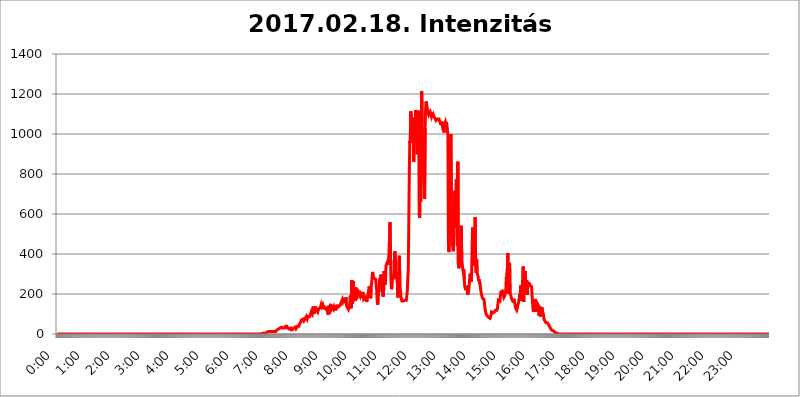
| Category | 2017.02.18. Intenzitás [W/m^2] |
|---|---|
| 0.0 | 0 |
| 0.0006944444444444445 | 0 |
| 0.001388888888888889 | 0 |
| 0.0020833333333333333 | 0 |
| 0.002777777777777778 | 0 |
| 0.003472222222222222 | 0 |
| 0.004166666666666667 | 0 |
| 0.004861111111111111 | 0 |
| 0.005555555555555556 | 0 |
| 0.0062499999999999995 | 0 |
| 0.006944444444444444 | 0 |
| 0.007638888888888889 | 0 |
| 0.008333333333333333 | 0 |
| 0.009027777777777779 | 0 |
| 0.009722222222222222 | 0 |
| 0.010416666666666666 | 0 |
| 0.011111111111111112 | 0 |
| 0.011805555555555555 | 0 |
| 0.012499999999999999 | 0 |
| 0.013194444444444444 | 0 |
| 0.013888888888888888 | 0 |
| 0.014583333333333332 | 0 |
| 0.015277777777777777 | 0 |
| 0.015972222222222224 | 0 |
| 0.016666666666666666 | 0 |
| 0.017361111111111112 | 0 |
| 0.018055555555555557 | 0 |
| 0.01875 | 0 |
| 0.019444444444444445 | 0 |
| 0.02013888888888889 | 0 |
| 0.020833333333333332 | 0 |
| 0.02152777777777778 | 0 |
| 0.022222222222222223 | 0 |
| 0.02291666666666667 | 0 |
| 0.02361111111111111 | 0 |
| 0.024305555555555556 | 0 |
| 0.024999999999999998 | 0 |
| 0.025694444444444447 | 0 |
| 0.02638888888888889 | 0 |
| 0.027083333333333334 | 0 |
| 0.027777777777777776 | 0 |
| 0.02847222222222222 | 0 |
| 0.029166666666666664 | 0 |
| 0.029861111111111113 | 0 |
| 0.030555555555555555 | 0 |
| 0.03125 | 0 |
| 0.03194444444444445 | 0 |
| 0.03263888888888889 | 0 |
| 0.03333333333333333 | 0 |
| 0.034027777777777775 | 0 |
| 0.034722222222222224 | 0 |
| 0.035416666666666666 | 0 |
| 0.036111111111111115 | 0 |
| 0.03680555555555556 | 0 |
| 0.0375 | 0 |
| 0.03819444444444444 | 0 |
| 0.03888888888888889 | 0 |
| 0.03958333333333333 | 0 |
| 0.04027777777777778 | 0 |
| 0.04097222222222222 | 0 |
| 0.041666666666666664 | 0 |
| 0.042361111111111106 | 0 |
| 0.04305555555555556 | 0 |
| 0.043750000000000004 | 0 |
| 0.044444444444444446 | 0 |
| 0.04513888888888889 | 0 |
| 0.04583333333333334 | 0 |
| 0.04652777777777778 | 0 |
| 0.04722222222222222 | 0 |
| 0.04791666666666666 | 0 |
| 0.04861111111111111 | 0 |
| 0.049305555555555554 | 0 |
| 0.049999999999999996 | 0 |
| 0.05069444444444445 | 0 |
| 0.051388888888888894 | 0 |
| 0.052083333333333336 | 0 |
| 0.05277777777777778 | 0 |
| 0.05347222222222222 | 0 |
| 0.05416666666666667 | 0 |
| 0.05486111111111111 | 0 |
| 0.05555555555555555 | 0 |
| 0.05625 | 0 |
| 0.05694444444444444 | 0 |
| 0.057638888888888885 | 0 |
| 0.05833333333333333 | 0 |
| 0.05902777777777778 | 0 |
| 0.059722222222222225 | 0 |
| 0.06041666666666667 | 0 |
| 0.061111111111111116 | 0 |
| 0.06180555555555556 | 0 |
| 0.0625 | 0 |
| 0.06319444444444444 | 0 |
| 0.06388888888888888 | 0 |
| 0.06458333333333334 | 0 |
| 0.06527777777777778 | 0 |
| 0.06597222222222222 | 0 |
| 0.06666666666666667 | 0 |
| 0.06736111111111111 | 0 |
| 0.06805555555555555 | 0 |
| 0.06874999999999999 | 0 |
| 0.06944444444444443 | 0 |
| 0.07013888888888889 | 0 |
| 0.07083333333333333 | 0 |
| 0.07152777777777779 | 0 |
| 0.07222222222222223 | 0 |
| 0.07291666666666667 | 0 |
| 0.07361111111111111 | 0 |
| 0.07430555555555556 | 0 |
| 0.075 | 0 |
| 0.07569444444444444 | 0 |
| 0.0763888888888889 | 0 |
| 0.07708333333333334 | 0 |
| 0.07777777777777778 | 0 |
| 0.07847222222222222 | 0 |
| 0.07916666666666666 | 0 |
| 0.0798611111111111 | 0 |
| 0.08055555555555556 | 0 |
| 0.08125 | 0 |
| 0.08194444444444444 | 0 |
| 0.08263888888888889 | 0 |
| 0.08333333333333333 | 0 |
| 0.08402777777777777 | 0 |
| 0.08472222222222221 | 0 |
| 0.08541666666666665 | 0 |
| 0.08611111111111112 | 0 |
| 0.08680555555555557 | 0 |
| 0.08750000000000001 | 0 |
| 0.08819444444444445 | 0 |
| 0.08888888888888889 | 0 |
| 0.08958333333333333 | 0 |
| 0.09027777777777778 | 0 |
| 0.09097222222222222 | 0 |
| 0.09166666666666667 | 0 |
| 0.09236111111111112 | 0 |
| 0.09305555555555556 | 0 |
| 0.09375 | 0 |
| 0.09444444444444444 | 0 |
| 0.09513888888888888 | 0 |
| 0.09583333333333333 | 0 |
| 0.09652777777777777 | 0 |
| 0.09722222222222222 | 0 |
| 0.09791666666666667 | 0 |
| 0.09861111111111111 | 0 |
| 0.09930555555555555 | 0 |
| 0.09999999999999999 | 0 |
| 0.10069444444444443 | 0 |
| 0.1013888888888889 | 0 |
| 0.10208333333333335 | 0 |
| 0.10277777777777779 | 0 |
| 0.10347222222222223 | 0 |
| 0.10416666666666667 | 0 |
| 0.10486111111111111 | 0 |
| 0.10555555555555556 | 0 |
| 0.10625 | 0 |
| 0.10694444444444444 | 0 |
| 0.1076388888888889 | 0 |
| 0.10833333333333334 | 0 |
| 0.10902777777777778 | 0 |
| 0.10972222222222222 | 0 |
| 0.1111111111111111 | 0 |
| 0.11180555555555556 | 0 |
| 0.11180555555555556 | 0 |
| 0.1125 | 0 |
| 0.11319444444444444 | 0 |
| 0.11388888888888889 | 0 |
| 0.11458333333333333 | 0 |
| 0.11527777777777777 | 0 |
| 0.11597222222222221 | 0 |
| 0.11666666666666665 | 0 |
| 0.1173611111111111 | 0 |
| 0.11805555555555557 | 0 |
| 0.11944444444444445 | 0 |
| 0.12013888888888889 | 0 |
| 0.12083333333333333 | 0 |
| 0.12152777777777778 | 0 |
| 0.12222222222222223 | 0 |
| 0.12291666666666667 | 0 |
| 0.12291666666666667 | 0 |
| 0.12361111111111112 | 0 |
| 0.12430555555555556 | 0 |
| 0.125 | 0 |
| 0.12569444444444444 | 0 |
| 0.12638888888888888 | 0 |
| 0.12708333333333333 | 0 |
| 0.16875 | 0 |
| 0.12847222222222224 | 0 |
| 0.12916666666666668 | 0 |
| 0.12986111111111112 | 0 |
| 0.13055555555555556 | 0 |
| 0.13125 | 0 |
| 0.13194444444444445 | 0 |
| 0.1326388888888889 | 0 |
| 0.13333333333333333 | 0 |
| 0.13402777777777777 | 0 |
| 0.13402777777777777 | 0 |
| 0.13472222222222222 | 0 |
| 0.13541666666666666 | 0 |
| 0.1361111111111111 | 0 |
| 0.13749999999999998 | 0 |
| 0.13819444444444443 | 0 |
| 0.1388888888888889 | 0 |
| 0.13958333333333334 | 0 |
| 0.14027777777777778 | 0 |
| 0.14097222222222222 | 0 |
| 0.14166666666666666 | 0 |
| 0.1423611111111111 | 0 |
| 0.14305555555555557 | 0 |
| 0.14375000000000002 | 0 |
| 0.14444444444444446 | 0 |
| 0.1451388888888889 | 0 |
| 0.1451388888888889 | 0 |
| 0.14652777777777778 | 0 |
| 0.14722222222222223 | 0 |
| 0.14791666666666667 | 0 |
| 0.1486111111111111 | 0 |
| 0.14930555555555555 | 0 |
| 0.15 | 0 |
| 0.15069444444444444 | 0 |
| 0.15138888888888888 | 0 |
| 0.15208333333333332 | 0 |
| 0.15277777777777776 | 0 |
| 0.15347222222222223 | 0 |
| 0.15416666666666667 | 0 |
| 0.15486111111111112 | 0 |
| 0.15555555555555556 | 0 |
| 0.15625 | 0 |
| 0.15694444444444444 | 0 |
| 0.15763888888888888 | 0 |
| 0.15833333333333333 | 0 |
| 0.15902777777777777 | 0 |
| 0.15972222222222224 | 0 |
| 0.16041666666666668 | 0 |
| 0.16111111111111112 | 0 |
| 0.16180555555555556 | 0 |
| 0.1625 | 0 |
| 0.16319444444444445 | 0 |
| 0.1638888888888889 | 0 |
| 0.16458333333333333 | 0 |
| 0.16527777777777777 | 0 |
| 0.16597222222222222 | 0 |
| 0.16666666666666666 | 0 |
| 0.1673611111111111 | 0 |
| 0.16805555555555554 | 0 |
| 0.16874999999999998 | 0 |
| 0.16944444444444443 | 0 |
| 0.17013888888888887 | 0 |
| 0.1708333333333333 | 0 |
| 0.17152777777777775 | 0 |
| 0.17222222222222225 | 0 |
| 0.1729166666666667 | 0 |
| 0.17361111111111113 | 0 |
| 0.17430555555555557 | 0 |
| 0.17500000000000002 | 0 |
| 0.17569444444444446 | 0 |
| 0.1763888888888889 | 0 |
| 0.17708333333333334 | 0 |
| 0.17777777777777778 | 0 |
| 0.17847222222222223 | 0 |
| 0.17916666666666667 | 0 |
| 0.1798611111111111 | 0 |
| 0.18055555555555555 | 0 |
| 0.18125 | 0 |
| 0.18194444444444444 | 0 |
| 0.1826388888888889 | 0 |
| 0.18333333333333335 | 0 |
| 0.1840277777777778 | 0 |
| 0.18472222222222223 | 0 |
| 0.18541666666666667 | 0 |
| 0.18611111111111112 | 0 |
| 0.18680555555555556 | 0 |
| 0.1875 | 0 |
| 0.18819444444444444 | 0 |
| 0.18888888888888888 | 0 |
| 0.18958333333333333 | 0 |
| 0.19027777777777777 | 0 |
| 0.1909722222222222 | 0 |
| 0.19166666666666665 | 0 |
| 0.19236111111111112 | 0 |
| 0.19305555555555554 | 0 |
| 0.19375 | 0 |
| 0.19444444444444445 | 0 |
| 0.1951388888888889 | 0 |
| 0.19583333333333333 | 0 |
| 0.19652777777777777 | 0 |
| 0.19722222222222222 | 0 |
| 0.19791666666666666 | 0 |
| 0.1986111111111111 | 0 |
| 0.19930555555555554 | 0 |
| 0.19999999999999998 | 0 |
| 0.20069444444444443 | 0 |
| 0.20138888888888887 | 0 |
| 0.2020833333333333 | 0 |
| 0.2027777777777778 | 0 |
| 0.2034722222222222 | 0 |
| 0.2041666666666667 | 0 |
| 0.20486111111111113 | 0 |
| 0.20555555555555557 | 0 |
| 0.20625000000000002 | 0 |
| 0.20694444444444446 | 0 |
| 0.2076388888888889 | 0 |
| 0.20833333333333334 | 0 |
| 0.20902777777777778 | 0 |
| 0.20972222222222223 | 0 |
| 0.21041666666666667 | 0 |
| 0.2111111111111111 | 0 |
| 0.21180555555555555 | 0 |
| 0.2125 | 0 |
| 0.21319444444444444 | 0 |
| 0.2138888888888889 | 0 |
| 0.21458333333333335 | 0 |
| 0.2152777777777778 | 0 |
| 0.21597222222222223 | 0 |
| 0.21666666666666667 | 0 |
| 0.21736111111111112 | 0 |
| 0.21805555555555556 | 0 |
| 0.21875 | 0 |
| 0.21944444444444444 | 0 |
| 0.22013888888888888 | 0 |
| 0.22083333333333333 | 0 |
| 0.22152777777777777 | 0 |
| 0.2222222222222222 | 0 |
| 0.22291666666666665 | 0 |
| 0.2236111111111111 | 0 |
| 0.22430555555555556 | 0 |
| 0.225 | 0 |
| 0.22569444444444445 | 0 |
| 0.2263888888888889 | 0 |
| 0.22708333333333333 | 0 |
| 0.22777777777777777 | 0 |
| 0.22847222222222222 | 0 |
| 0.22916666666666666 | 0 |
| 0.2298611111111111 | 0 |
| 0.23055555555555554 | 0 |
| 0.23124999999999998 | 0 |
| 0.23194444444444443 | 0 |
| 0.23263888888888887 | 0 |
| 0.2333333333333333 | 0 |
| 0.2340277777777778 | 0 |
| 0.2347222222222222 | 0 |
| 0.2354166666666667 | 0 |
| 0.23611111111111113 | 0 |
| 0.23680555555555557 | 0 |
| 0.23750000000000002 | 0 |
| 0.23819444444444446 | 0 |
| 0.2388888888888889 | 0 |
| 0.23958333333333334 | 0 |
| 0.24027777777777778 | 0 |
| 0.24097222222222223 | 0 |
| 0.24166666666666667 | 0 |
| 0.2423611111111111 | 0 |
| 0.24305555555555555 | 0 |
| 0.24375 | 0 |
| 0.24444444444444446 | 0 |
| 0.24513888888888888 | 0 |
| 0.24583333333333335 | 0 |
| 0.2465277777777778 | 0 |
| 0.24722222222222223 | 0 |
| 0.24791666666666667 | 0 |
| 0.24861111111111112 | 0 |
| 0.24930555555555556 | 0 |
| 0.25 | 0 |
| 0.25069444444444444 | 0 |
| 0.2513888888888889 | 0 |
| 0.2520833333333333 | 0 |
| 0.25277777777777777 | 0 |
| 0.2534722222222222 | 0 |
| 0.25416666666666665 | 0 |
| 0.2548611111111111 | 0 |
| 0.2555555555555556 | 0 |
| 0.25625000000000003 | 0 |
| 0.2569444444444445 | 0 |
| 0.2576388888888889 | 0 |
| 0.25833333333333336 | 0 |
| 0.2590277777777778 | 0 |
| 0.25972222222222224 | 0 |
| 0.2604166666666667 | 0 |
| 0.2611111111111111 | 0 |
| 0.26180555555555557 | 0 |
| 0.2625 | 0 |
| 0.26319444444444445 | 0 |
| 0.2638888888888889 | 0 |
| 0.26458333333333334 | 0 |
| 0.2652777777777778 | 0 |
| 0.2659722222222222 | 0 |
| 0.26666666666666666 | 0 |
| 0.2673611111111111 | 0 |
| 0.26805555555555555 | 0 |
| 0.26875 | 0 |
| 0.26944444444444443 | 0 |
| 0.2701388888888889 | 0 |
| 0.2708333333333333 | 0 |
| 0.27152777777777776 | 0 |
| 0.2722222222222222 | 0 |
| 0.27291666666666664 | 0 |
| 0.2736111111111111 | 0 |
| 0.2743055555555555 | 0 |
| 0.27499999999999997 | 0 |
| 0.27569444444444446 | 0 |
| 0.27638888888888885 | 0 |
| 0.27708333333333335 | 0 |
| 0.2777777777777778 | 0 |
| 0.27847222222222223 | 0 |
| 0.2791666666666667 | 0 |
| 0.2798611111111111 | 0 |
| 0.28055555555555556 | 0 |
| 0.28125 | 0 |
| 0.28194444444444444 | 0 |
| 0.2826388888888889 | 0 |
| 0.2833333333333333 | 0 |
| 0.28402777777777777 | 0 |
| 0.2847222222222222 | 0 |
| 0.28541666666666665 | 0 |
| 0.28611111111111115 | 3.525 |
| 0.28680555555555554 | 3.525 |
| 0.28750000000000003 | 3.525 |
| 0.2881944444444445 | 3.525 |
| 0.2888888888888889 | 3.525 |
| 0.28958333333333336 | 3.525 |
| 0.2902777777777778 | 3.525 |
| 0.29097222222222224 | 3.525 |
| 0.2916666666666667 | 3.525 |
| 0.2923611111111111 | 7.887 |
| 0.29305555555555557 | 7.887 |
| 0.29375 | 7.887 |
| 0.29444444444444445 | 7.887 |
| 0.2951388888888889 | 7.887 |
| 0.29583333333333334 | 12.257 |
| 0.2965277777777778 | 12.257 |
| 0.2972222222222222 | 12.257 |
| 0.29791666666666666 | 12.257 |
| 0.2986111111111111 | 12.257 |
| 0.29930555555555555 | 12.257 |
| 0.3 | 12.257 |
| 0.30069444444444443 | 12.257 |
| 0.3013888888888889 | 12.257 |
| 0.3020833333333333 | 12.257 |
| 0.30277777777777776 | 12.257 |
| 0.3034722222222222 | 12.257 |
| 0.30416666666666664 | 12.257 |
| 0.3048611111111111 | 16.636 |
| 0.3055555555555555 | 16.636 |
| 0.30624999999999997 | 12.257 |
| 0.3069444444444444 | 16.636 |
| 0.3076388888888889 | 16.636 |
| 0.30833333333333335 | 21.024 |
| 0.3090277777777778 | 21.024 |
| 0.30972222222222223 | 21.024 |
| 0.3104166666666667 | 25.419 |
| 0.3111111111111111 | 25.419 |
| 0.31180555555555556 | 29.823 |
| 0.3125 | 29.823 |
| 0.31319444444444444 | 34.234 |
| 0.3138888888888889 | 34.234 |
| 0.3145833333333333 | 34.234 |
| 0.31527777777777777 | 38.653 |
| 0.3159722222222222 | 38.653 |
| 0.31666666666666665 | 29.823 |
| 0.31736111111111115 | 25.419 |
| 0.31805555555555554 | 25.419 |
| 0.31875000000000003 | 29.823 |
| 0.3194444444444445 | 34.234 |
| 0.3201388888888889 | 38.653 |
| 0.32083333333333336 | 38.653 |
| 0.3215277777777778 | 38.653 |
| 0.32222222222222224 | 38.653 |
| 0.3229166666666667 | 29.823 |
| 0.3236111111111111 | 29.823 |
| 0.32430555555555557 | 25.419 |
| 0.325 | 25.419 |
| 0.32569444444444445 | 21.024 |
| 0.3263888888888889 | 25.419 |
| 0.32708333333333334 | 29.823 |
| 0.3277777777777778 | 21.024 |
| 0.3284722222222222 | 25.419 |
| 0.32916666666666666 | 25.419 |
| 0.3298611111111111 | 21.024 |
| 0.33055555555555555 | 21.024 |
| 0.33125 | 29.823 |
| 0.33194444444444443 | 34.234 |
| 0.3326388888888889 | 34.234 |
| 0.3333333333333333 | 34.234 |
| 0.3340277777777778 | 34.234 |
| 0.3347222222222222 | 25.419 |
| 0.3354166666666667 | 25.419 |
| 0.3361111111111111 | 29.823 |
| 0.3368055555555556 | 38.653 |
| 0.33749999999999997 | 43.079 |
| 0.33819444444444446 | 38.653 |
| 0.33888888888888885 | 38.653 |
| 0.33958333333333335 | 47.511 |
| 0.34027777777777773 | 51.951 |
| 0.34097222222222223 | 51.951 |
| 0.3416666666666666 | 60.85 |
| 0.3423611111111111 | 69.775 |
| 0.3430555555555555 | 65.31 |
| 0.34375 | 69.775 |
| 0.3444444444444445 | 74.246 |
| 0.3451388888888889 | 74.246 |
| 0.3458333333333334 | 65.31 |
| 0.34652777777777777 | 69.775 |
| 0.34722222222222227 | 74.246 |
| 0.34791666666666665 | 74.246 |
| 0.34861111111111115 | 74.246 |
| 0.34930555555555554 | 87.692 |
| 0.35000000000000003 | 92.184 |
| 0.3506944444444444 | 74.246 |
| 0.3513888888888889 | 69.775 |
| 0.3520833333333333 | 87.692 |
| 0.3527777777777778 | 92.184 |
| 0.3534722222222222 | 87.692 |
| 0.3541666666666667 | 87.692 |
| 0.3548611111111111 | 92.184 |
| 0.35555555555555557 | 92.184 |
| 0.35625 | 110.201 |
| 0.35694444444444445 | 110.201 |
| 0.3576388888888889 | 101.184 |
| 0.35833333333333334 | 123.758 |
| 0.3590277777777778 | 137.347 |
| 0.3597222222222222 | 123.758 |
| 0.36041666666666666 | 101.184 |
| 0.3611111111111111 | 114.716 |
| 0.36180555555555555 | 137.347 |
| 0.3625 | 141.884 |
| 0.36319444444444443 | 123.758 |
| 0.3638888888888889 | 123.758 |
| 0.3645833333333333 | 128.284 |
| 0.3652777777777778 | 110.201 |
| 0.3659722222222222 | 119.235 |
| 0.3666666666666667 | 123.758 |
| 0.3673611111111111 | 128.284 |
| 0.3680555555555556 | 132.814 |
| 0.36874999999999997 | 128.284 |
| 0.36944444444444446 | 137.347 |
| 0.37013888888888885 | 146.423 |
| 0.37083333333333335 | 137.347 |
| 0.37152777777777773 | 132.814 |
| 0.37222222222222223 | 146.423 |
| 0.3729166666666666 | 132.814 |
| 0.3736111111111111 | 123.758 |
| 0.3743055555555555 | 137.347 |
| 0.375 | 132.814 |
| 0.3756944444444445 | 132.814 |
| 0.3763888888888889 | 132.814 |
| 0.3770833333333334 | 123.758 |
| 0.37777777777777777 | 119.235 |
| 0.37847222222222227 | 128.284 |
| 0.37916666666666665 | 114.716 |
| 0.37986111111111115 | 96.682 |
| 0.38055555555555554 | 132.814 |
| 0.38125000000000003 | 141.884 |
| 0.3819444444444444 | 119.235 |
| 0.3826388888888889 | 137.347 |
| 0.3833333333333333 | 150.964 |
| 0.3840277777777778 | 119.235 |
| 0.3847222222222222 | 123.758 |
| 0.3854166666666667 | 114.716 |
| 0.3861111111111111 | 132.814 |
| 0.38680555555555557 | 137.347 |
| 0.3875 | 123.758 |
| 0.38819444444444445 | 132.814 |
| 0.3888888888888889 | 123.758 |
| 0.38958333333333334 | 123.758 |
| 0.3902777777777778 | 128.284 |
| 0.3909722222222222 | 123.758 |
| 0.39166666666666666 | 128.284 |
| 0.3923611111111111 | 146.423 |
| 0.39305555555555555 | 132.814 |
| 0.39375 | 132.814 |
| 0.39444444444444443 | 132.814 |
| 0.3951388888888889 | 137.347 |
| 0.3958333333333333 | 137.347 |
| 0.3965277777777778 | 141.884 |
| 0.3972222222222222 | 146.423 |
| 0.3979166666666667 | 155.509 |
| 0.3986111111111111 | 155.509 |
| 0.3993055555555556 | 160.056 |
| 0.39999999999999997 | 173.709 |
| 0.40069444444444446 | 164.605 |
| 0.40138888888888885 | 173.709 |
| 0.40208333333333335 | 169.156 |
| 0.40277777777777773 | 178.264 |
| 0.40347222222222223 | 173.709 |
| 0.4041666666666666 | 155.509 |
| 0.4048611111111111 | 182.82 |
| 0.4055555555555555 | 146.423 |
| 0.40625 | 137.347 |
| 0.4069444444444445 | 141.884 |
| 0.4076388888888889 | 137.347 |
| 0.4083333333333334 | 123.758 |
| 0.40902777777777777 | 132.814 |
| 0.40972222222222227 | 146.423 |
| 0.41041666666666665 | 128.284 |
| 0.41111111111111115 | 191.937 |
| 0.41180555555555554 | 137.347 |
| 0.41250000000000003 | 128.284 |
| 0.4131944444444444 | 269.49 |
| 0.4138888888888889 | 150.964 |
| 0.4145833333333333 | 164.605 |
| 0.4152777777777778 | 264.932 |
| 0.4159722222222222 | 178.264 |
| 0.4166666666666667 | 169.156 |
| 0.4173611111111111 | 205.62 |
| 0.41805555555555557 | 164.605 |
| 0.41875 | 233 |
| 0.41944444444444445 | 191.937 |
| 0.4201388888888889 | 173.709 |
| 0.42083333333333334 | 219.309 |
| 0.4215277777777778 | 191.937 |
| 0.4222222222222222 | 187.378 |
| 0.42291666666666666 | 210.182 |
| 0.4236111111111111 | 205.62 |
| 0.42430555555555555 | 201.058 |
| 0.425 | 191.937 |
| 0.42569444444444443 | 201.058 |
| 0.4263888888888889 | 201.058 |
| 0.4270833333333333 | 191.937 |
| 0.4277777777777778 | 201.058 |
| 0.4284722222222222 | 210.182 |
| 0.4291666666666667 | 196.497 |
| 0.4298611111111111 | 173.709 |
| 0.4305555555555556 | 169.156 |
| 0.43124999999999997 | 173.709 |
| 0.43194444444444446 | 182.82 |
| 0.43263888888888885 | 182.82 |
| 0.43333333333333335 | 169.156 |
| 0.43402777777777773 | 160.056 |
| 0.43472222222222223 | 173.709 |
| 0.4354166666666666 | 178.264 |
| 0.4361111111111111 | 205.62 |
| 0.4368055555555555 | 219.309 |
| 0.4375 | 237.564 |
| 0.4381944444444445 | 214.746 |
| 0.4388888888888889 | 219.309 |
| 0.4395833333333334 | 178.264 |
| 0.44027777777777777 | 242.127 |
| 0.44097222222222227 | 255.813 |
| 0.44166666666666665 | 287.709 |
| 0.44236111111111115 | 310.44 |
| 0.44305555555555554 | 287.709 |
| 0.44375000000000003 | 287.709 |
| 0.4444444444444444 | 278.603 |
| 0.4451388888888889 | 278.603 |
| 0.4458333333333333 | 278.603 |
| 0.4465277777777778 | 274.047 |
| 0.4472222222222222 | 278.603 |
| 0.4479166666666667 | 223.873 |
| 0.4486111111111111 | 173.709 |
| 0.44930555555555557 | 146.423 |
| 0.45 | 160.056 |
| 0.45069444444444445 | 210.182 |
| 0.4513888888888889 | 223.873 |
| 0.45208333333333334 | 278.603 |
| 0.4527777777777778 | 255.813 |
| 0.4534722222222222 | 283.156 |
| 0.45416666666666666 | 296.808 |
| 0.4548611111111111 | 246.689 |
| 0.45555555555555555 | 210.182 |
| 0.45625 | 237.564 |
| 0.45694444444444443 | 187.378 |
| 0.4576388888888889 | 201.058 |
| 0.4583333333333333 | 314.98 |
| 0.4590277777777778 | 310.44 |
| 0.4597222222222222 | 246.689 |
| 0.4604166666666667 | 274.047 |
| 0.4611111111111111 | 342.162 |
| 0.4618055555555556 | 346.682 |
| 0.46249999999999997 | 342.162 |
| 0.46319444444444446 | 360.221 |
| 0.46388888888888885 | 346.682 |
| 0.46458333333333335 | 360.221 |
| 0.46527777777777773 | 405.108 |
| 0.46597222222222223 | 471.582 |
| 0.4666666666666666 | 558.261 |
| 0.4673611111111111 | 396.164 |
| 0.4680555555555555 | 269.49 |
| 0.46875 | 223.873 |
| 0.4694444444444445 | 237.564 |
| 0.4701388888888889 | 278.603 |
| 0.4708333333333334 | 278.603 |
| 0.47152777777777777 | 287.709 |
| 0.47222222222222227 | 274.047 |
| 0.47291666666666665 | 382.715 |
| 0.47361111111111115 | 414.035 |
| 0.47430555555555554 | 364.728 |
| 0.47500000000000003 | 278.603 |
| 0.4756944444444444 | 305.898 |
| 0.4763888888888889 | 278.603 |
| 0.4770833333333333 | 251.251 |
| 0.4777777777777778 | 182.82 |
| 0.4784722222222222 | 260.373 |
| 0.4791666666666667 | 369.23 |
| 0.4798611111111111 | 391.685 |
| 0.48055555555555557 | 242.127 |
| 0.48125 | 219.309 |
| 0.48194444444444445 | 191.937 |
| 0.4826388888888889 | 173.709 |
| 0.48333333333333334 | 164.605 |
| 0.4840277777777778 | 160.056 |
| 0.4847222222222222 | 160.056 |
| 0.48541666666666666 | 164.605 |
| 0.4861111111111111 | 164.605 |
| 0.48680555555555555 | 164.605 |
| 0.4875 | 169.156 |
| 0.48819444444444443 | 173.709 |
| 0.4888888888888889 | 169.156 |
| 0.4895833333333333 | 169.156 |
| 0.4902777777777778 | 173.709 |
| 0.4909722222222222 | 214.746 |
| 0.4916666666666667 | 278.603 |
| 0.4923611111111111 | 324.052 |
| 0.4930555555555556 | 558.261 |
| 0.49374999999999997 | 791.169 |
| 0.49444444444444446 | 966.295 |
| 0.49513888888888885 | 955.071 |
| 0.49583333333333335 | 1112.618 |
| 0.49652777777777773 | 1089.873 |
| 0.49722222222222223 | 1052.255 |
| 0.4979166666666666 | 1074.789 |
| 0.4986111111111111 | 1074.789 |
| 0.4993055555555555 | 1059.756 |
| 0.5 | 860.676 |
| 0.5006944444444444 | 1082.324 |
| 0.5013888888888889 | 1063.51 |
| 0.5020833333333333 | 966.295 |
| 0.5027777777777778 | 1120.238 |
| 0.5034722222222222 | 1116.426 |
| 0.5041666666666667 | 996.182 |
| 0.5048611111111111 | 898.668 |
| 0.5055555555555555 | 999.916 |
| 0.50625 | 1116.426 |
| 0.5069444444444444 | 1089.873 |
| 0.5076388888888889 | 596.45 |
| 0.5083333333333333 | 579.542 |
| 0.5090277777777777 | 973.772 |
| 0.5097222222222222 | 663.019 |
| 0.5104166666666666 | 894.885 |
| 0.5111111111111112 | 1213.804 |
| 0.5118055555555555 | 1056.004 |
| 0.5125000000000001 | 1059.756 |
| 0.5131944444444444 | 787.258 |
| 0.513888888888889 | 928.819 |
| 0.5145833333333333 | 751.803 |
| 0.5152777777777778 | 675.311 |
| 0.5159722222222222 | 1029.798 |
| 0.5166666666666667 | 1127.879 |
| 0.517361111111111 | 1162.571 |
| 0.5180555555555556 | 1147.086 |
| 0.5187499999999999 | 1135.543 |
| 0.5194444444444445 | 1112.618 |
| 0.5201388888888888 | 1108.816 |
| 0.5208333333333334 | 1097.437 |
| 0.5215277777777778 | 1105.019 |
| 0.5222222222222223 | 1105.019 |
| 0.5229166666666667 | 1112.618 |
| 0.5236111111111111 | 1112.618 |
| 0.5243055555555556 | 1108.816 |
| 0.525 | 1086.097 |
| 0.5256944444444445 | 1093.653 |
| 0.5263888888888889 | 1093.653 |
| 0.5270833333333333 | 1101.226 |
| 0.5277777777777778 | 1093.653 |
| 0.5284722222222222 | 1086.097 |
| 0.5291666666666667 | 1082.324 |
| 0.5298611111111111 | 1082.324 |
| 0.5305555555555556 | 1074.789 |
| 0.53125 | 1067.267 |
| 0.5319444444444444 | 1067.267 |
| 0.5326388888888889 | 1067.267 |
| 0.5333333333333333 | 1074.789 |
| 0.5340277777777778 | 1071.027 |
| 0.5347222222222222 | 1071.027 |
| 0.5354166666666667 | 1074.789 |
| 0.5361111111111111 | 1071.027 |
| 0.5368055555555555 | 1071.027 |
| 0.5375 | 1052.255 |
| 0.5381944444444444 | 1052.255 |
| 0.5388888888888889 | 1052.255 |
| 0.5395833333333333 | 1056.004 |
| 0.5402777777777777 | 1037.277 |
| 0.5409722222222222 | 1033.537 |
| 0.5416666666666666 | 1044.762 |
| 0.5423611111111112 | 1007.383 |
| 0.5430555555555555 | 1029.798 |
| 0.5437500000000001 | 1052.255 |
| 0.5444444444444444 | 1059.756 |
| 0.545138888888889 | 1048.508 |
| 0.5458333333333333 | 1059.756 |
| 0.5465277777777778 | 1044.762 |
| 0.5472222222222222 | 1018.587 |
| 0.5479166666666667 | 992.448 |
| 0.548611111111111 | 462.786 |
| 0.5493055555555556 | 409.574 |
| 0.5499999999999999 | 405.108 |
| 0.5506944444444445 | 519.555 |
| 0.5513888888888888 | 921.298 |
| 0.5520833333333334 | 999.916 |
| 0.5527777777777778 | 667.123 |
| 0.5534722222222223 | 515.223 |
| 0.5541666666666667 | 600.661 |
| 0.5548611111111111 | 436.27 |
| 0.5555555555555556 | 414.035 |
| 0.55625 | 532.513 |
| 0.5569444444444445 | 675.311 |
| 0.5576388888888889 | 715.858 |
| 0.5583333333333333 | 617.436 |
| 0.5590277777777778 | 532.513 |
| 0.5597222222222222 | 775.492 |
| 0.5604166666666667 | 747.834 |
| 0.5611111111111111 | 440.702 |
| 0.5618055555555556 | 860.676 |
| 0.5625 | 351.198 |
| 0.5631944444444444 | 328.584 |
| 0.5638888888888889 | 333.113 |
| 0.5645833333333333 | 351.198 |
| 0.5652777777777778 | 391.685 |
| 0.5659722222222222 | 409.574 |
| 0.5666666666666667 | 541.121 |
| 0.5673611111111111 | 373.729 |
| 0.5680555555555555 | 369.23 |
| 0.56875 | 324.052 |
| 0.5694444444444444 | 314.98 |
| 0.5701388888888889 | 324.052 |
| 0.5708333333333333 | 274.047 |
| 0.5715277777777777 | 237.564 |
| 0.5722222222222222 | 228.436 |
| 0.5729166666666666 | 223.873 |
| 0.5736111111111112 | 233 |
| 0.5743055555555555 | 233 |
| 0.5750000000000001 | 214.746 |
| 0.5756944444444444 | 196.497 |
| 0.576388888888889 | 201.058 |
| 0.5770833333333333 | 219.309 |
| 0.5777777777777778 | 246.689 |
| 0.5784722222222222 | 278.603 |
| 0.5791666666666667 | 301.354 |
| 0.579861111111111 | 274.047 |
| 0.5805555555555556 | 260.373 |
| 0.5812499999999999 | 310.44 |
| 0.5819444444444445 | 453.968 |
| 0.5826388888888888 | 532.513 |
| 0.5833333333333334 | 414.035 |
| 0.5840277777777778 | 342.162 |
| 0.5847222222222223 | 346.682 |
| 0.5854166666666667 | 364.728 |
| 0.5861111111111111 | 583.779 |
| 0.5868055555555556 | 364.728 |
| 0.5875 | 305.898 |
| 0.5881944444444445 | 373.729 |
| 0.5888888888888889 | 305.898 |
| 0.5895833333333333 | 305.898 |
| 0.5902777777777778 | 287.709 |
| 0.5909722222222222 | 264.932 |
| 0.5916666666666667 | 274.047 |
| 0.5923611111111111 | 278.603 |
| 0.5930555555555556 | 246.689 |
| 0.59375 | 223.873 |
| 0.5944444444444444 | 210.182 |
| 0.5951388888888889 | 196.497 |
| 0.5958333333333333 | 187.378 |
| 0.5965277777777778 | 178.264 |
| 0.5972222222222222 | 173.709 |
| 0.5979166666666667 | 173.709 |
| 0.5986111111111111 | 173.709 |
| 0.5993055555555555 | 150.964 |
| 0.6 | 123.758 |
| 0.6006944444444444 | 114.716 |
| 0.6013888888888889 | 101.184 |
| 0.6020833333333333 | 96.682 |
| 0.6027777777777777 | 92.184 |
| 0.6034722222222222 | 92.184 |
| 0.6041666666666666 | 87.692 |
| 0.6048611111111112 | 83.205 |
| 0.6055555555555555 | 78.722 |
| 0.6062500000000001 | 78.722 |
| 0.6069444444444444 | 78.722 |
| 0.607638888888889 | 83.205 |
| 0.6083333333333333 | 92.184 |
| 0.6090277777777778 | 110.201 |
| 0.6097222222222222 | 114.716 |
| 0.6104166666666667 | 105.69 |
| 0.611111111111111 | 105.69 |
| 0.6118055555555556 | 105.69 |
| 0.6124999999999999 | 110.201 |
| 0.6131944444444445 | 110.201 |
| 0.6138888888888888 | 114.716 |
| 0.6145833333333334 | 119.235 |
| 0.6152777777777778 | 114.716 |
| 0.6159722222222223 | 114.716 |
| 0.6166666666666667 | 119.235 |
| 0.6173611111111111 | 128.284 |
| 0.6180555555555556 | 150.964 |
| 0.61875 | 169.156 |
| 0.6194444444444445 | 169.156 |
| 0.6201388888888889 | 164.605 |
| 0.6208333333333333 | 164.605 |
| 0.6215277777777778 | 191.937 |
| 0.6222222222222222 | 210.182 |
| 0.6229166666666667 | 210.182 |
| 0.6236111111111111 | 214.746 |
| 0.6243055555555556 | 214.746 |
| 0.625 | 205.62 |
| 0.6256944444444444 | 191.937 |
| 0.6263888888888889 | 182.82 |
| 0.6270833333333333 | 187.378 |
| 0.6277777777777778 | 191.937 |
| 0.6284722222222222 | 205.62 |
| 0.6291666666666667 | 223.873 |
| 0.6298611111111111 | 287.709 |
| 0.6305555555555555 | 274.047 |
| 0.63125 | 324.052 |
| 0.6319444444444444 | 405.108 |
| 0.6326388888888889 | 223.873 |
| 0.6333333333333333 | 201.058 |
| 0.6340277777777777 | 355.712 |
| 0.6347222222222222 | 346.682 |
| 0.6354166666666666 | 201.058 |
| 0.6361111111111112 | 191.937 |
| 0.6368055555555555 | 182.82 |
| 0.6375000000000001 | 173.709 |
| 0.6381944444444444 | 169.156 |
| 0.638888888888889 | 164.605 |
| 0.6395833333333333 | 164.605 |
| 0.6402777777777778 | 169.156 |
| 0.6409722222222222 | 169.156 |
| 0.6416666666666667 | 155.509 |
| 0.642361111111111 | 137.347 |
| 0.6430555555555556 | 128.284 |
| 0.6437499999999999 | 123.758 |
| 0.6444444444444445 | 119.235 |
| 0.6451388888888888 | 128.284 |
| 0.6458333333333334 | 141.884 |
| 0.6465277777777778 | 150.964 |
| 0.6472222222222223 | 160.056 |
| 0.6479166666666667 | 160.056 |
| 0.6486111111111111 | 201.058 |
| 0.6493055555555556 | 164.605 |
| 0.65 | 242.127 |
| 0.6506944444444445 | 237.564 |
| 0.6513888888888889 | 173.709 |
| 0.6520833333333333 | 173.709 |
| 0.6527777777777778 | 269.49 |
| 0.6534722222222222 | 337.639 |
| 0.6541666666666667 | 160.056 |
| 0.6548611111111111 | 255.813 |
| 0.6555555555555556 | 278.603 |
| 0.65625 | 314.98 |
| 0.6569444444444444 | 246.689 |
| 0.6576388888888889 | 223.873 |
| 0.6583333333333333 | 269.49 |
| 0.6590277777777778 | 196.497 |
| 0.6597222222222222 | 228.436 |
| 0.6604166666666667 | 255.813 |
| 0.6611111111111111 | 255.813 |
| 0.6618055555555555 | 251.251 |
| 0.6625 | 251.251 |
| 0.6631944444444444 | 242.127 |
| 0.6638888888888889 | 242.127 |
| 0.6645833333333333 | 246.689 |
| 0.6652777777777777 | 237.564 |
| 0.6659722222222222 | 191.937 |
| 0.6666666666666666 | 155.509 |
| 0.6673611111111111 | 119.235 |
| 0.6680555555555556 | 110.201 |
| 0.6687500000000001 | 160.056 |
| 0.6694444444444444 | 173.709 |
| 0.6701388888888888 | 128.284 |
| 0.6708333333333334 | 155.509 |
| 0.6715277777777778 | 123.758 |
| 0.6722222222222222 | 110.201 |
| 0.6729166666666666 | 155.509 |
| 0.6736111111111112 | 160.056 |
| 0.6743055555555556 | 155.509 |
| 0.6749999999999999 | 141.884 |
| 0.6756944444444444 | 92.184 |
| 0.6763888888888889 | 92.184 |
| 0.6770833333333334 | 137.347 |
| 0.6777777777777777 | 87.692 |
| 0.6784722222222223 | 132.814 |
| 0.6791666666666667 | 123.758 |
| 0.6798611111111111 | 132.814 |
| 0.6805555555555555 | 114.716 |
| 0.68125 | 114.716 |
| 0.6819444444444445 | 96.682 |
| 0.6826388888888889 | 74.246 |
| 0.6833333333333332 | 69.775 |
| 0.6840277777777778 | 65.31 |
| 0.6847222222222222 | 60.85 |
| 0.6854166666666667 | 56.398 |
| 0.686111111111111 | 56.398 |
| 0.6868055555555556 | 56.398 |
| 0.6875 | 56.398 |
| 0.6881944444444444 | 51.951 |
| 0.688888888888889 | 47.511 |
| 0.6895833333333333 | 43.079 |
| 0.6902777777777778 | 38.653 |
| 0.6909722222222222 | 34.234 |
| 0.6916666666666668 | 29.823 |
| 0.6923611111111111 | 25.419 |
| 0.6930555555555555 | 21.024 |
| 0.69375 | 21.024 |
| 0.6944444444444445 | 16.636 |
| 0.6951388888888889 | 16.636 |
| 0.6958333333333333 | 16.636 |
| 0.6965277777777777 | 12.257 |
| 0.6972222222222223 | 12.257 |
| 0.6979166666666666 | 7.887 |
| 0.6986111111111111 | 7.887 |
| 0.6993055555555556 | 3.525 |
| 0.7000000000000001 | 3.525 |
| 0.7006944444444444 | 3.525 |
| 0.7013888888888888 | 3.525 |
| 0.7020833333333334 | 3.525 |
| 0.7027777777777778 | 3.525 |
| 0.7034722222222222 | 0 |
| 0.7041666666666666 | 0 |
| 0.7048611111111112 | 0 |
| 0.7055555555555556 | 0 |
| 0.7062499999999999 | 0 |
| 0.7069444444444444 | 0 |
| 0.7076388888888889 | 0 |
| 0.7083333333333334 | 0 |
| 0.7090277777777777 | 0 |
| 0.7097222222222223 | 0 |
| 0.7104166666666667 | 0 |
| 0.7111111111111111 | 0 |
| 0.7118055555555555 | 0 |
| 0.7125 | 0 |
| 0.7131944444444445 | 0 |
| 0.7138888888888889 | 0 |
| 0.7145833333333332 | 0 |
| 0.7152777777777778 | 0 |
| 0.7159722222222222 | 0 |
| 0.7166666666666667 | 0 |
| 0.717361111111111 | 0 |
| 0.7180555555555556 | 0 |
| 0.71875 | 0 |
| 0.7194444444444444 | 0 |
| 0.720138888888889 | 0 |
| 0.7208333333333333 | 0 |
| 0.7215277777777778 | 0 |
| 0.7222222222222222 | 0 |
| 0.7229166666666668 | 0 |
| 0.7236111111111111 | 0 |
| 0.7243055555555555 | 0 |
| 0.725 | 0 |
| 0.7256944444444445 | 0 |
| 0.7263888888888889 | 0 |
| 0.7270833333333333 | 0 |
| 0.7277777777777777 | 0 |
| 0.7284722222222223 | 0 |
| 0.7291666666666666 | 0 |
| 0.7298611111111111 | 0 |
| 0.7305555555555556 | 0 |
| 0.7312500000000001 | 0 |
| 0.7319444444444444 | 0 |
| 0.7326388888888888 | 0 |
| 0.7333333333333334 | 0 |
| 0.7340277777777778 | 0 |
| 0.7347222222222222 | 0 |
| 0.7354166666666666 | 0 |
| 0.7361111111111112 | 0 |
| 0.7368055555555556 | 0 |
| 0.7374999999999999 | 0 |
| 0.7381944444444444 | 0 |
| 0.7388888888888889 | 0 |
| 0.7395833333333334 | 0 |
| 0.7402777777777777 | 0 |
| 0.7409722222222223 | 0 |
| 0.7416666666666667 | 0 |
| 0.7423611111111111 | 0 |
| 0.7430555555555555 | 0 |
| 0.74375 | 0 |
| 0.7444444444444445 | 0 |
| 0.7451388888888889 | 0 |
| 0.7458333333333332 | 0 |
| 0.7465277777777778 | 0 |
| 0.7472222222222222 | 0 |
| 0.7479166666666667 | 0 |
| 0.748611111111111 | 0 |
| 0.7493055555555556 | 0 |
| 0.75 | 0 |
| 0.7506944444444444 | 0 |
| 0.751388888888889 | 0 |
| 0.7520833333333333 | 0 |
| 0.7527777777777778 | 0 |
| 0.7534722222222222 | 0 |
| 0.7541666666666668 | 0 |
| 0.7548611111111111 | 0 |
| 0.7555555555555555 | 0 |
| 0.75625 | 0 |
| 0.7569444444444445 | 0 |
| 0.7576388888888889 | 0 |
| 0.7583333333333333 | 0 |
| 0.7590277777777777 | 0 |
| 0.7597222222222223 | 0 |
| 0.7604166666666666 | 0 |
| 0.7611111111111111 | 0 |
| 0.7618055555555556 | 0 |
| 0.7625000000000001 | 0 |
| 0.7631944444444444 | 0 |
| 0.7638888888888888 | 0 |
| 0.7645833333333334 | 0 |
| 0.7652777777777778 | 0 |
| 0.7659722222222222 | 0 |
| 0.7666666666666666 | 0 |
| 0.7673611111111112 | 0 |
| 0.7680555555555556 | 0 |
| 0.7687499999999999 | 0 |
| 0.7694444444444444 | 0 |
| 0.7701388888888889 | 0 |
| 0.7708333333333334 | 0 |
| 0.7715277777777777 | 0 |
| 0.7722222222222223 | 0 |
| 0.7729166666666667 | 0 |
| 0.7736111111111111 | 0 |
| 0.7743055555555555 | 0 |
| 0.775 | 0 |
| 0.7756944444444445 | 0 |
| 0.7763888888888889 | 0 |
| 0.7770833333333332 | 0 |
| 0.7777777777777778 | 0 |
| 0.7784722222222222 | 0 |
| 0.7791666666666667 | 0 |
| 0.779861111111111 | 0 |
| 0.7805555555555556 | 0 |
| 0.78125 | 0 |
| 0.7819444444444444 | 0 |
| 0.782638888888889 | 0 |
| 0.7833333333333333 | 0 |
| 0.7840277777777778 | 0 |
| 0.7847222222222222 | 0 |
| 0.7854166666666668 | 0 |
| 0.7861111111111111 | 0 |
| 0.7868055555555555 | 0 |
| 0.7875 | 0 |
| 0.7881944444444445 | 0 |
| 0.7888888888888889 | 0 |
| 0.7895833333333333 | 0 |
| 0.7902777777777777 | 0 |
| 0.7909722222222223 | 0 |
| 0.7916666666666666 | 0 |
| 0.7923611111111111 | 0 |
| 0.7930555555555556 | 0 |
| 0.7937500000000001 | 0 |
| 0.7944444444444444 | 0 |
| 0.7951388888888888 | 0 |
| 0.7958333333333334 | 0 |
| 0.7965277777777778 | 0 |
| 0.7972222222222222 | 0 |
| 0.7979166666666666 | 0 |
| 0.7986111111111112 | 0 |
| 0.7993055555555556 | 0 |
| 0.7999999999999999 | 0 |
| 0.8006944444444444 | 0 |
| 0.8013888888888889 | 0 |
| 0.8020833333333334 | 0 |
| 0.8027777777777777 | 0 |
| 0.8034722222222223 | 0 |
| 0.8041666666666667 | 0 |
| 0.8048611111111111 | 0 |
| 0.8055555555555555 | 0 |
| 0.80625 | 0 |
| 0.8069444444444445 | 0 |
| 0.8076388888888889 | 0 |
| 0.8083333333333332 | 0 |
| 0.8090277777777778 | 0 |
| 0.8097222222222222 | 0 |
| 0.8104166666666667 | 0 |
| 0.811111111111111 | 0 |
| 0.8118055555555556 | 0 |
| 0.8125 | 0 |
| 0.8131944444444444 | 0 |
| 0.813888888888889 | 0 |
| 0.8145833333333333 | 0 |
| 0.8152777777777778 | 0 |
| 0.8159722222222222 | 0 |
| 0.8166666666666668 | 0 |
| 0.8173611111111111 | 0 |
| 0.8180555555555555 | 0 |
| 0.81875 | 0 |
| 0.8194444444444445 | 0 |
| 0.8201388888888889 | 0 |
| 0.8208333333333333 | 0 |
| 0.8215277777777777 | 0 |
| 0.8222222222222223 | 0 |
| 0.8229166666666666 | 0 |
| 0.8236111111111111 | 0 |
| 0.8243055555555556 | 0 |
| 0.8250000000000001 | 0 |
| 0.8256944444444444 | 0 |
| 0.8263888888888888 | 0 |
| 0.8270833333333334 | 0 |
| 0.8277777777777778 | 0 |
| 0.8284722222222222 | 0 |
| 0.8291666666666666 | 0 |
| 0.8298611111111112 | 0 |
| 0.8305555555555556 | 0 |
| 0.8312499999999999 | 0 |
| 0.8319444444444444 | 0 |
| 0.8326388888888889 | 0 |
| 0.8333333333333334 | 0 |
| 0.8340277777777777 | 0 |
| 0.8347222222222223 | 0 |
| 0.8354166666666667 | 0 |
| 0.8361111111111111 | 0 |
| 0.8368055555555555 | 0 |
| 0.8375 | 0 |
| 0.8381944444444445 | 0 |
| 0.8388888888888889 | 0 |
| 0.8395833333333332 | 0 |
| 0.8402777777777778 | 0 |
| 0.8409722222222222 | 0 |
| 0.8416666666666667 | 0 |
| 0.842361111111111 | 0 |
| 0.8430555555555556 | 0 |
| 0.84375 | 0 |
| 0.8444444444444444 | 0 |
| 0.845138888888889 | 0 |
| 0.8458333333333333 | 0 |
| 0.8465277777777778 | 0 |
| 0.8472222222222222 | 0 |
| 0.8479166666666668 | 0 |
| 0.8486111111111111 | 0 |
| 0.8493055555555555 | 0 |
| 0.85 | 0 |
| 0.8506944444444445 | 0 |
| 0.8513888888888889 | 0 |
| 0.8520833333333333 | 0 |
| 0.8527777777777777 | 0 |
| 0.8534722222222223 | 0 |
| 0.8541666666666666 | 0 |
| 0.8548611111111111 | 0 |
| 0.8555555555555556 | 0 |
| 0.8562500000000001 | 0 |
| 0.8569444444444444 | 0 |
| 0.8576388888888888 | 0 |
| 0.8583333333333334 | 0 |
| 0.8590277777777778 | 0 |
| 0.8597222222222222 | 0 |
| 0.8604166666666666 | 0 |
| 0.8611111111111112 | 0 |
| 0.8618055555555556 | 0 |
| 0.8624999999999999 | 0 |
| 0.8631944444444444 | 0 |
| 0.8638888888888889 | 0 |
| 0.8645833333333334 | 0 |
| 0.8652777777777777 | 0 |
| 0.8659722222222223 | 0 |
| 0.8666666666666667 | 0 |
| 0.8673611111111111 | 0 |
| 0.8680555555555555 | 0 |
| 0.86875 | 0 |
| 0.8694444444444445 | 0 |
| 0.8701388888888889 | 0 |
| 0.8708333333333332 | 0 |
| 0.8715277777777778 | 0 |
| 0.8722222222222222 | 0 |
| 0.8729166666666667 | 0 |
| 0.873611111111111 | 0 |
| 0.8743055555555556 | 0 |
| 0.875 | 0 |
| 0.8756944444444444 | 0 |
| 0.876388888888889 | 0 |
| 0.8770833333333333 | 0 |
| 0.8777777777777778 | 0 |
| 0.8784722222222222 | 0 |
| 0.8791666666666668 | 0 |
| 0.8798611111111111 | 0 |
| 0.8805555555555555 | 0 |
| 0.88125 | 0 |
| 0.8819444444444445 | 0 |
| 0.8826388888888889 | 0 |
| 0.8833333333333333 | 0 |
| 0.8840277777777777 | 0 |
| 0.8847222222222223 | 0 |
| 0.8854166666666666 | 0 |
| 0.8861111111111111 | 0 |
| 0.8868055555555556 | 0 |
| 0.8875000000000001 | 0 |
| 0.8881944444444444 | 0 |
| 0.8888888888888888 | 0 |
| 0.8895833333333334 | 0 |
| 0.8902777777777778 | 0 |
| 0.8909722222222222 | 0 |
| 0.8916666666666666 | 0 |
| 0.8923611111111112 | 0 |
| 0.8930555555555556 | 0 |
| 0.8937499999999999 | 0 |
| 0.8944444444444444 | 0 |
| 0.8951388888888889 | 0 |
| 0.8958333333333334 | 0 |
| 0.8965277777777777 | 0 |
| 0.8972222222222223 | 0 |
| 0.8979166666666667 | 0 |
| 0.8986111111111111 | 0 |
| 0.8993055555555555 | 0 |
| 0.9 | 0 |
| 0.9006944444444445 | 0 |
| 0.9013888888888889 | 0 |
| 0.9020833333333332 | 0 |
| 0.9027777777777778 | 0 |
| 0.9034722222222222 | 0 |
| 0.9041666666666667 | 0 |
| 0.904861111111111 | 0 |
| 0.9055555555555556 | 0 |
| 0.90625 | 0 |
| 0.9069444444444444 | 0 |
| 0.907638888888889 | 0 |
| 0.9083333333333333 | 0 |
| 0.9090277777777778 | 0 |
| 0.9097222222222222 | 0 |
| 0.9104166666666668 | 0 |
| 0.9111111111111111 | 0 |
| 0.9118055555555555 | 0 |
| 0.9125 | 0 |
| 0.9131944444444445 | 0 |
| 0.9138888888888889 | 0 |
| 0.9145833333333333 | 0 |
| 0.9152777777777777 | 0 |
| 0.9159722222222223 | 0 |
| 0.9166666666666666 | 0 |
| 0.9173611111111111 | 0 |
| 0.9180555555555556 | 0 |
| 0.9187500000000001 | 0 |
| 0.9194444444444444 | 0 |
| 0.9201388888888888 | 0 |
| 0.9208333333333334 | 0 |
| 0.9215277777777778 | 0 |
| 0.9222222222222222 | 0 |
| 0.9229166666666666 | 0 |
| 0.9236111111111112 | 0 |
| 0.9243055555555556 | 0 |
| 0.9249999999999999 | 0 |
| 0.9256944444444444 | 0 |
| 0.9263888888888889 | 0 |
| 0.9270833333333334 | 0 |
| 0.9277777777777777 | 0 |
| 0.9284722222222223 | 0 |
| 0.9291666666666667 | 0 |
| 0.9298611111111111 | 0 |
| 0.9305555555555555 | 0 |
| 0.93125 | 0 |
| 0.9319444444444445 | 0 |
| 0.9326388888888889 | 0 |
| 0.9333333333333332 | 0 |
| 0.9340277777777778 | 0 |
| 0.9347222222222222 | 0 |
| 0.9354166666666667 | 0 |
| 0.936111111111111 | 0 |
| 0.9368055555555556 | 0 |
| 0.9375 | 0 |
| 0.9381944444444444 | 0 |
| 0.938888888888889 | 0 |
| 0.9395833333333333 | 0 |
| 0.9402777777777778 | 0 |
| 0.9409722222222222 | 0 |
| 0.9416666666666668 | 0 |
| 0.9423611111111111 | 0 |
| 0.9430555555555555 | 0 |
| 0.94375 | 0 |
| 0.9444444444444445 | 0 |
| 0.9451388888888889 | 0 |
| 0.9458333333333333 | 0 |
| 0.9465277777777777 | 0 |
| 0.9472222222222223 | 0 |
| 0.9479166666666666 | 0 |
| 0.9486111111111111 | 0 |
| 0.9493055555555556 | 0 |
| 0.9500000000000001 | 0 |
| 0.9506944444444444 | 0 |
| 0.9513888888888888 | 0 |
| 0.9520833333333334 | 0 |
| 0.9527777777777778 | 0 |
| 0.9534722222222222 | 0 |
| 0.9541666666666666 | 0 |
| 0.9548611111111112 | 0 |
| 0.9555555555555556 | 0 |
| 0.9562499999999999 | 0 |
| 0.9569444444444444 | 0 |
| 0.9576388888888889 | 0 |
| 0.9583333333333334 | 0 |
| 0.9590277777777777 | 0 |
| 0.9597222222222223 | 0 |
| 0.9604166666666667 | 0 |
| 0.9611111111111111 | 0 |
| 0.9618055555555555 | 0 |
| 0.9625 | 0 |
| 0.9631944444444445 | 0 |
| 0.9638888888888889 | 0 |
| 0.9645833333333332 | 0 |
| 0.9652777777777778 | 0 |
| 0.9659722222222222 | 0 |
| 0.9666666666666667 | 0 |
| 0.967361111111111 | 0 |
| 0.9680555555555556 | 0 |
| 0.96875 | 0 |
| 0.9694444444444444 | 0 |
| 0.970138888888889 | 0 |
| 0.9708333333333333 | 0 |
| 0.9715277777777778 | 0 |
| 0.9722222222222222 | 0 |
| 0.9729166666666668 | 0 |
| 0.9736111111111111 | 0 |
| 0.9743055555555555 | 0 |
| 0.975 | 0 |
| 0.9756944444444445 | 0 |
| 0.9763888888888889 | 0 |
| 0.9770833333333333 | 0 |
| 0.9777777777777777 | 0 |
| 0.9784722222222223 | 0 |
| 0.9791666666666666 | 0 |
| 0.9798611111111111 | 0 |
| 0.9805555555555556 | 0 |
| 0.9812500000000001 | 0 |
| 0.9819444444444444 | 0 |
| 0.9826388888888888 | 0 |
| 0.9833333333333334 | 0 |
| 0.9840277777777778 | 0 |
| 0.9847222222222222 | 0 |
| 0.9854166666666666 | 0 |
| 0.9861111111111112 | 0 |
| 0.9868055555555556 | 0 |
| 0.9874999999999999 | 0 |
| 0.9881944444444444 | 0 |
| 0.9888888888888889 | 0 |
| 0.9895833333333334 | 0 |
| 0.9902777777777777 | 0 |
| 0.9909722222222223 | 0 |
| 0.9916666666666667 | 0 |
| 0.9923611111111111 | 0 |
| 0.9930555555555555 | 0 |
| 0.99375 | 0 |
| 0.9944444444444445 | 0 |
| 0.9951388888888889 | 0 |
| 0.9958333333333332 | 0 |
| 0.9965277777777778 | 0 |
| 0.9972222222222222 | 0 |
| 0.9979166666666667 | 0 |
| 0.998611111111111 | 0 |
| 0.9993055555555556 | 0 |